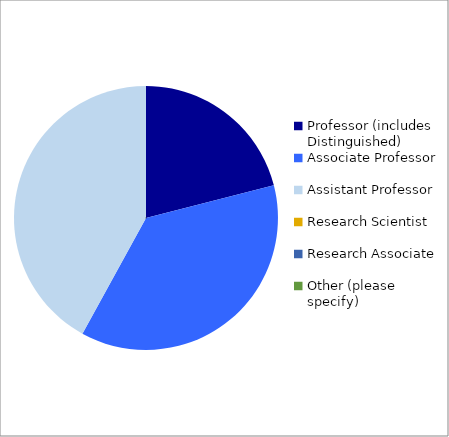
| Category | Series 0 |
|---|---|
| Professor (includes Distinguished) | 0.21 |
| Associate Professor | 0.37 |
| Assistant Professor | 0.42 |
| Research Scientist | 0 |
| Research Associate | 0 |
| Other (please specify) | 0 |